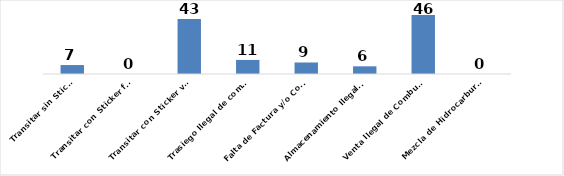
| Category | Series 0 |
|---|---|
| Transitar sin Sticker | 7 |
| Transitar con Sticker falso | 0 |
| Transitar con Sticker vencido | 43 |
| Trasiego Ilegal de combustibles  | 11 |
| Falta de Factura y/o Conduce | 9 |
| Almacenamiento Ilegal de Combustibles  | 6 |
| Venta Ilegal de Combustibles  | 46 |
| Mezcla de Hidrocarburos en Desechos | 0 |